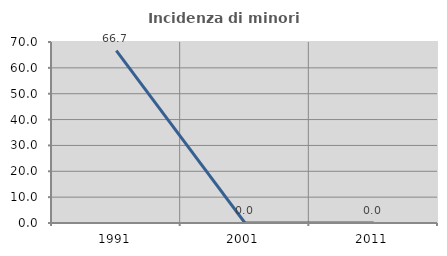
| Category | Incidenza di minori stranieri |
|---|---|
| 1991.0 | 66.667 |
| 2001.0 | 0 |
| 2011.0 | 0 |